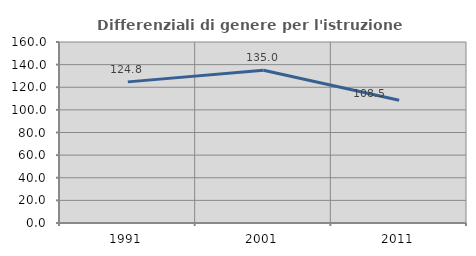
| Category | Differenziali di genere per l'istruzione superiore |
|---|---|
| 1991.0 | 124.755 |
| 2001.0 | 134.972 |
| 2011.0 | 108.466 |